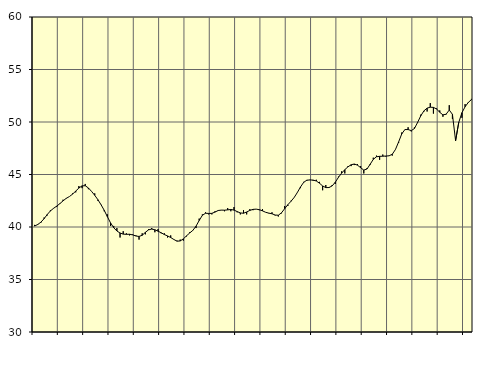
| Category | Piggar | Samtliga fast anställda (inkl. fast anställda utomlands)1 |
|---|---|---|
| nan | 40.2 | 40.09 |
| 87.0 | 40.2 | 40.24 |
| 87.0 | 40.4 | 40.46 |
| 87.0 | 40.9 | 40.79 |
| nan | 41.1 | 41.19 |
| 88.0 | 41.6 | 41.53 |
| 88.0 | 41.8 | 41.78 |
| 88.0 | 41.9 | 41.99 |
| nan | 42.2 | 42.23 |
| 89.0 | 42.6 | 42.49 |
| 89.0 | 42.7 | 42.73 |
| 89.0 | 42.9 | 42.9 |
| nan | 43.2 | 43.13 |
| 90.0 | 43.3 | 43.42 |
| 90.0 | 43.9 | 43.71 |
| 90.0 | 43.7 | 43.92 |
| nan | 44.1 | 43.93 |
| 91.0 | 43.6 | 43.72 |
| 91.0 | 43.4 | 43.39 |
| 91.0 | 43.2 | 43.02 |
| nan | 42.5 | 42.6 |
| 92.0 | 42.1 | 42.12 |
| 92.0 | 41.5 | 41.59 |
| 92.0 | 41.2 | 40.98 |
| nan | 40.1 | 40.39 |
| 93.0 | 40.1 | 39.93 |
| 93.0 | 39.9 | 39.62 |
| 93.0 | 39 | 39.43 |
| nan | 39.6 | 39.32 |
| 94.0 | 39.4 | 39.3 |
| 94.0 | 39.2 | 39.31 |
| 94.0 | 39.3 | 39.25 |
| nan | 39.2 | 39.14 |
| 95.0 | 38.8 | 39.1 |
| 95.0 | 39.4 | 39.21 |
| 95.0 | 39.3 | 39.49 |
| nan | 39.8 | 39.73 |
| 96.0 | 39.9 | 39.8 |
| 96.0 | 39.5 | 39.74 |
| 96.0 | 39.8 | 39.6 |
| nan | 39.4 | 39.45 |
| 97.0 | 39.4 | 39.28 |
| 97.0 | 39 | 39.15 |
| 97.0 | 39.2 | 39 |
| nan | 38.8 | 38.81 |
| 98.0 | 38.7 | 38.65 |
| 98.0 | 38.8 | 38.67 |
| 98.0 | 38.7 | 38.87 |
| nan | 39.1 | 39.16 |
| 99.0 | 39.5 | 39.43 |
| 99.0 | 39.7 | 39.68 |
| 99.0 | 39.9 | 40.08 |
| nan | 40.8 | 40.62 |
| 0.0 | 41.2 | 41.11 |
| 0.0 | 41.4 | 41.31 |
| 0.0 | 41.2 | 41.29 |
| nan | 41.2 | 41.3 |
| 1.0 | 41.5 | 41.42 |
| 1.0 | 41.6 | 41.57 |
| 1.0 | 41.6 | 41.61 |
| nan | 41.5 | 41.6 |
| 2.0 | 41.8 | 41.63 |
| 2.0 | 41.5 | 41.67 |
| 2.0 | 41.9 | 41.61 |
| nan | 41.4 | 41.47 |
| 3.0 | 41.2 | 41.34 |
| 3.0 | 41.6 | 41.31 |
| 3.0 | 41.2 | 41.43 |
| nan | 41.7 | 41.58 |
| 4.0 | 41.6 | 41.68 |
| 4.0 | 41.7 | 41.7 |
| 4.0 | 41.6 | 41.65 |
| nan | 41.7 | 41.54 |
| 5.0 | 41.4 | 41.4 |
| 5.0 | 41.3 | 41.32 |
| 5.0 | 41.4 | 41.26 |
| nan | 41.1 | 41.14 |
| 6.0 | 41 | 41.12 |
| 6.0 | 41.3 | 41.35 |
| 6.0 | 42 | 41.74 |
| nan | 42 | 42.12 |
| 7.0 | 42.5 | 42.45 |
| 7.0 | 42.8 | 42.81 |
| 7.0 | 43.3 | 43.28 |
| nan | 43.7 | 43.81 |
| 8.0 | 44.3 | 44.25 |
| 8.0 | 44.4 | 44.46 |
| 8.0 | 44.5 | 44.48 |
| nan | 44.4 | 44.47 |
| 9.0 | 44.5 | 44.38 |
| 9.0 | 44.3 | 44.17 |
| 9.0 | 43.5 | 43.91 |
| nan | 44 | 43.75 |
| 10.0 | 43.8 | 43.76 |
| 10.0 | 44 | 43.91 |
| 10.0 | 44.1 | 44.27 |
| nan | 44.8 | 44.73 |
| 11.0 | 45.3 | 45.13 |
| 11.0 | 45.1 | 45.46 |
| 11.0 | 45.8 | 45.73 |
| nan | 45.8 | 45.93 |
| 12.0 | 45.9 | 46 |
| 12.0 | 46 | 45.89 |
| 12.0 | 45.8 | 45.65 |
| nan | 45.1 | 45.42 |
| 13.0 | 45.6 | 45.52 |
| 13.0 | 45.9 | 45.97 |
| 13.0 | 46.6 | 46.44 |
| nan | 46.8 | 46.69 |
| 14.0 | 46.4 | 46.73 |
| 14.0 | 46.9 | 46.74 |
| 14.0 | 46.7 | 46.76 |
| nan | 46.8 | 46.78 |
| 15.0 | 46.8 | 46.93 |
| 15.0 | 47.4 | 47.38 |
| 15.0 | 48 | 48.1 |
| nan | 49 | 48.87 |
| 16.0 | 49.3 | 49.28 |
| 16.0 | 49.5 | 49.28 |
| 16.0 | 49.1 | 49.18 |
| nan | 49.5 | 49.38 |
| 17.0 | 49.9 | 49.96 |
| 17.0 | 50.7 | 50.59 |
| 17.0 | 51 | 51.06 |
| nan | 51 | 51.32 |
| 18.0 | 51.8 | 51.41 |
| 18.0 | 50.8 | 51.39 |
| 18.0 | 51.3 | 51.24 |
| nan | 51.1 | 50.92 |
| 19.0 | 50.5 | 50.68 |
| 19.0 | 50.7 | 50.74 |
| 19.0 | 51.6 | 51.14 |
| nan | 50.3 | 50.73 |
| 20.0 | 48.3 | 48.23 |
| 20.0 | 50 | 49.96 |
| 20.0 | 50.4 | 50.88 |
| nan | 51.7 | 51.45 |
| 21.0 | 51.9 | 51.86 |
| 21.0 | 52.2 | 52.13 |